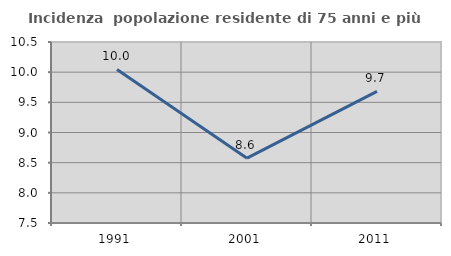
| Category | Incidenza  popolazione residente di 75 anni e più |
|---|---|
| 1991.0 | 10.044 |
| 2001.0 | 8.575 |
| 2011.0 | 9.681 |